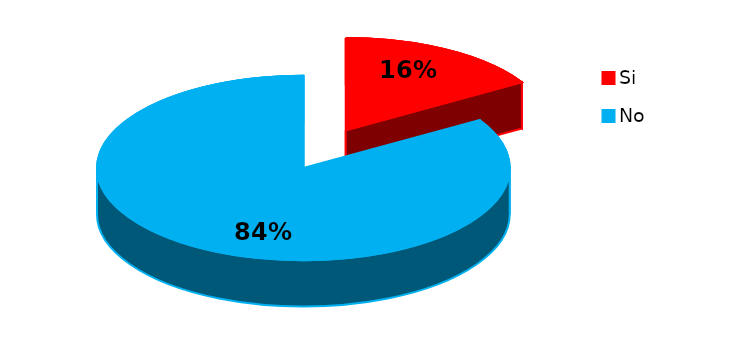
| Category | Series 0 |
|---|---|
| 0 | 7 |
| 1 | 36 |